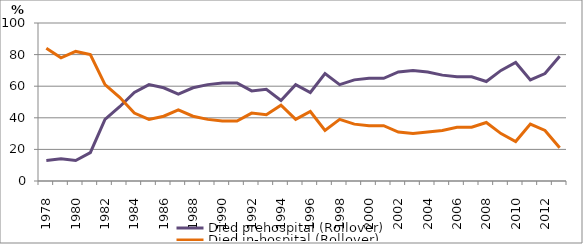
| Category | Died prehospital (Rollover) | Died in-hospital (Rollover) |
|---|---|---|
| 1978.0 | 13 | 84 |
| 1979.0 | 14 | 78 |
| 1980.0 | 13 | 82 |
| 1981.0 | 18 | 80 |
| 1982.0 | 39 | 61 |
| 1983.0 | 47 | 53 |
| 1984.0 | 56 | 43 |
| 1985.0 | 61 | 39 |
| 1986.0 | 59 | 41 |
| 1987.0 | 55 | 45 |
| 1988.0 | 59 | 41 |
| 1989.0 | 61 | 39 |
| 1990.0 | 62 | 38 |
| 1991.0 | 62 | 38 |
| 1992.0 | 57 | 43 |
| 1993.0 | 58 | 42 |
| 1994.0 | 51 | 48 |
| 1995.0 | 61 | 39 |
| 1996.0 | 56 | 44 |
| 1997.0 | 68 | 32 |
| 1998.0 | 61 | 39 |
| 1999.0 | 64 | 36 |
| 2000.0 | 65 | 35 |
| 2001.0 | 65 | 35 |
| 2002.0 | 69 | 31 |
| 2003.0 | 70 | 30 |
| 2004.0 | 69 | 31 |
| 2005.0 | 67 | 32 |
| 2006.0 | 66 | 34 |
| 2007.0 | 66 | 34 |
| 2008.0 | 63 | 37 |
| 2009.0 | 70 | 30 |
| 2010.0 | 75 | 25 |
| 2011.0 | 64 | 36 |
| 2012.0 | 68 | 32 |
| 2013.0 | 79 | 21 |